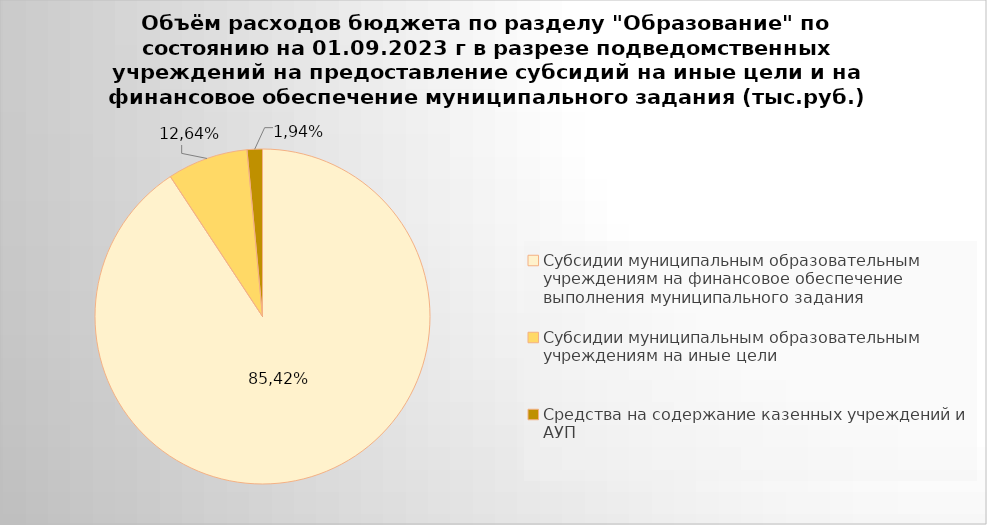
| Category | Series 0 |
|---|---|
| Субсидии муниципальным образовательным учреждениям на финансовое обеспечение выполнения муниципального задания | 7948981.07 |
| Субсидии муниципальным образовательным учреждениям на иные цели | 682523.33 |
| Средства на содержание казенных учреждений и АУП | 129680.76 |